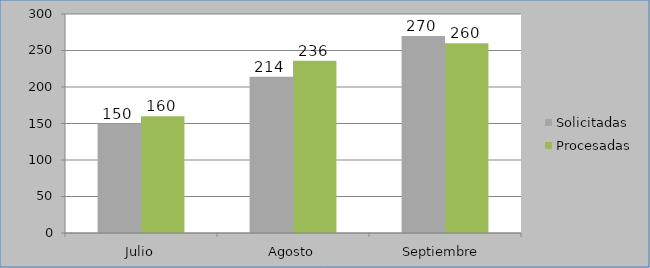
| Category | Solicitadas | Procesadas |
|---|---|---|
| Julio | 150 | 160 |
| Agosto | 214 | 236 |
| Septiembre  | 270 | 260 |